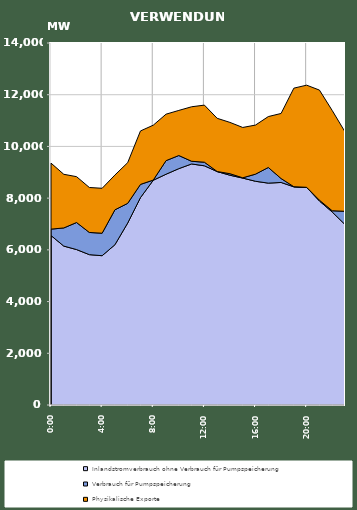
| Category | Inlandstromverbrauch ohne Verbrauch für Pumpspeicherung | Verbrauch für Pumpspeicherung | Physikalische Exporte |
|---|---|---|---|
| 2007-01-17 | 6554.548 | 247.115 | 2552.637 |
| 2007-01-17 01:00:00 | 6145.859 | 701.565 | 2074.971 |
| 2007-01-17 02:00:00 | 6011.147 | 1045.755 | 1773.891 |
| 2007-01-17 03:00:00 | 5814.696 | 858.302 | 1739.179 |
| 2007-01-17 04:00:00 | 5773.323 | 870.128 | 1737.347 |
| 2007-01-17 05:00:00 | 6197.449 | 1351.07 | 1345.077 |
| 2007-01-17 06:00:00 | 7037.33 | 761.021 | 1574.552 |
| 2007-01-17 07:00:00 | 8020.113 | 511.171 | 2067.71 |
| 2007-01-17 08:00:00 | 8691.925 | 6.386 | 2123.339 |
| 2007-01-17 09:00:00 | 8924.688 | 525.509 | 1797.275 |
| 2007-01-17 10:00:00 | 9140.615 | 507.674 | 1744.388 |
| 2007-01-17 11:00:00 | 9321.803 | 104.99 | 2106.62 |
| 2007-01-17 12:00:00 | 9250.829 | 139.042 | 2207.558 |
| 2007-01-17 13:00:00 | 9028.255 | 1.982 | 2057.426 |
| 2007-01-17 14:00:00 | 8886.492 | 58.11 | 1984.496 |
| 2007-01-17 15:00:00 | 8775.459 | 11.908 | 1946.096 |
| 2007-01-17 16:00:00 | 8652.446 | 275.48 | 1898.528 |
| 2007-01-17 17:00:00 | 8580.226 | 605.766 | 1968.469 |
| 2007-01-17 18:00:00 | 8606.52 | 152.465 | 2516.012 |
| 2007-01-17 19:00:00 | 8437.71 | 4.042 | 3812.161 |
| 2007-01-17 20:00:00 | 8416.074 | 3.051 | 3950.213 |
| 2007-01-17 21:00:00 | 7888.968 | 32.445 | 4257.642 |
| 2007-01-17 22:00:00 | 7463.409 | 48.578 | 3877.831 |
| 2007-01-17 23:00:00 | 6979.942 | 511.089 | 3074.171 |